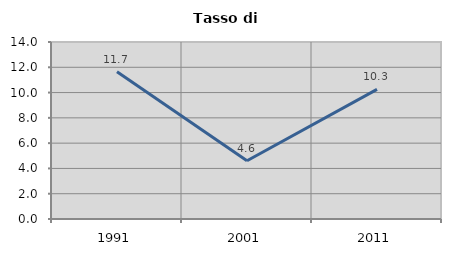
| Category | Tasso di disoccupazione   |
|---|---|
| 1991.0 | 11.655 |
| 2001.0 | 4.603 |
| 2011.0 | 10.254 |